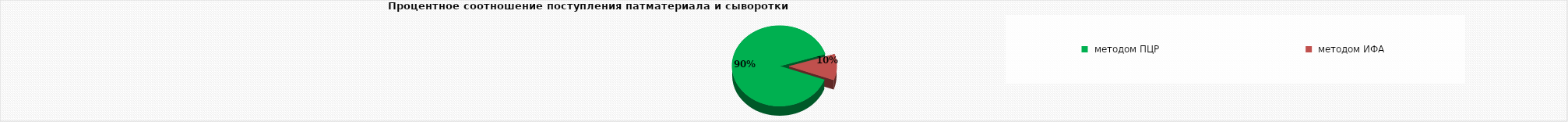
| Category | сыворотка | 1560 |
|---|---|---|
|  методом ПЦР | 1560 |  |
|  методом ИФА | 180 |  |